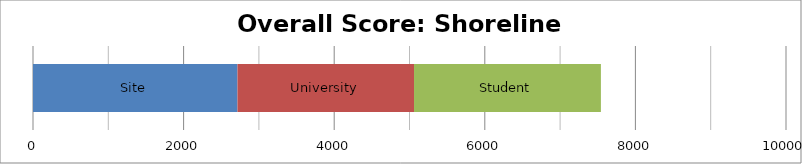
| Category | Site | University | Student |
|---|---|---|---|
| 0 | 2715.625 | 2344.375 | 2481.875 |